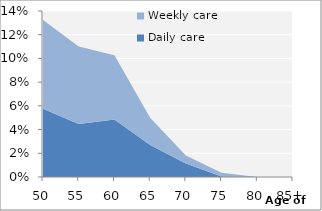
| Category | Daily care | Weekly care |
|---|---|---|
| 50 | 0.057 | 0.075 |
| 55 | 0.045 | 0.065 |
| 60 | 0.048 | 0.054 |
| 65 | 0.027 | 0.023 |
| 70 | 0.011 | 0.007 |
| 75 | 0 | 0.003 |
| 80 | 0 | 0 |
| 85+ | 0 | 0 |